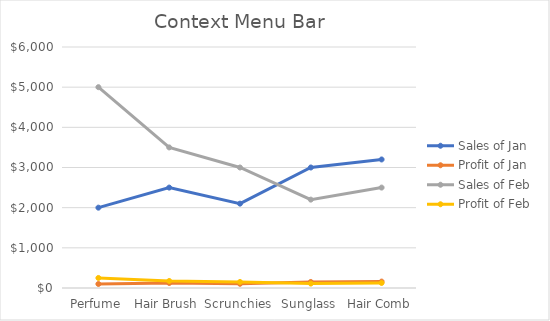
| Category | Sales of Jan | Profit of Jan | Sales of Feb | Profit of Feb |
|---|---|---|---|---|
| Perfume | 2000 | 100 | 5000 | 250 |
| Hair Brush | 2500 | 125 | 3500 | 175 |
| Scrunchies | 2100 | 105 | 3000 | 150 |
| Sunglass | 3000 | 150 | 2200 | 110 |
| Hair Comb | 3200 | 160 | 2500 | 125 |